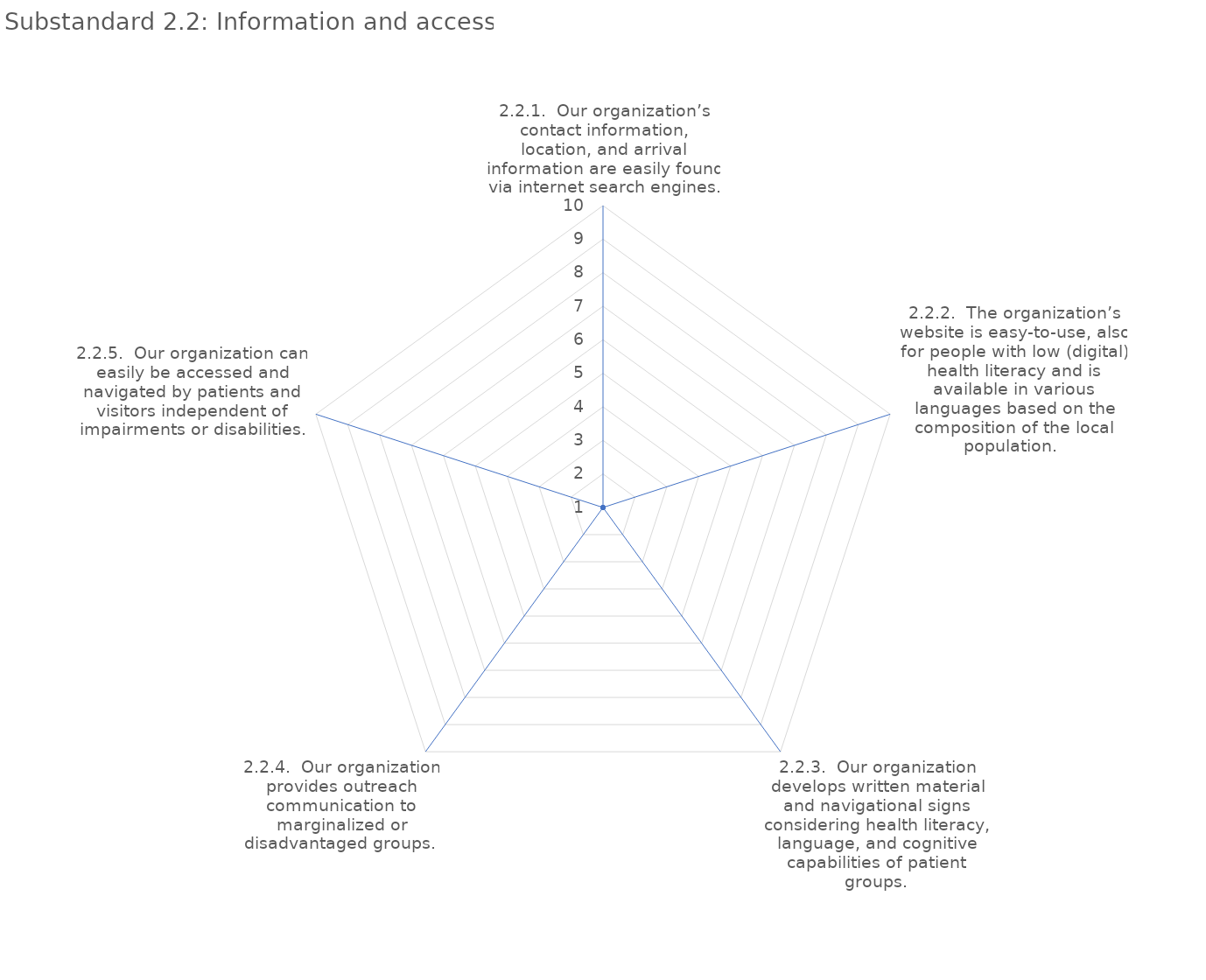
| Category | value |
|---|---|
| 2.2.1.  Our organization’s contact information, location, and arrival information are easily found via internet search engines. | 1 |
| 2.2.2.  The organization’s website is easy-to-use, also for people with low (digital) health literacy and is available in various languages based on the composition of the local population.  | 1 |
| 2.2.3.  Our organization develops written material and navigational signs considering health literacy, language, and cognitive capabilities of patient groups. | 1 |
| 2.2.4.  Our organization provides outreach communication to marginalized or disadvantaged groups.  | 1 |
| 2.2.5.  Our organization can easily be accessed and navigated by patients and visitors independent of impairments or disabilities. | 1 |